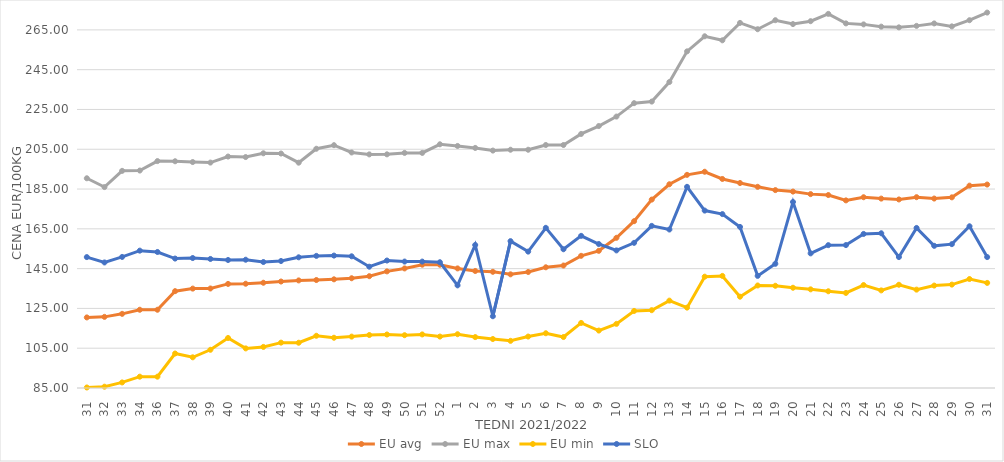
| Category | EU avg | EU max | EU min | SLO |
|---|---|---|---|---|
| 31.0 | 120.473 | 190.42 | 85.26 | 150.8 |
| 32.0 | 120.756 | 186 | 85.65 | 148.1 |
| 33.0 | 122.274 | 194.145 | 87.8 | 150.88 |
| 34.0 | 124.332 | 194.304 | 90.69 | 154.04 |
| 36.0 | 124.332 | 199.06 | 90.69 | 153.37 |
| 37.0 | 133.685 | 198.97 | 102.334 | 150.06 |
| 38.0 | 134.959 | 198.57 | 100.43 | 150.32 |
| 39.0 | 135.021 | 198.3 | 104.21 | 149.86 |
| 40.0 | 137.315 | 201.34 | 110.15 | 149.34 |
| 41.0 | 137.411 | 201.081 | 104.9 | 149.48 |
| 42.0 | 137.908 | 202.98 | 105.65 | 148.32 |
| 43.0 | 138.52 | 202.856 | 107.8 | 148.83 |
| 44.0 | 139.076 | 198.26 | 107.75 | 150.69 |
| 45.0 | 139.275 | 205.257 | 111.25 | 151.41 |
| 46.0 | 139.626 | 207.046 | 110.26 | 151.56 |
| 47.0 | 140.17 | 203.387 | 110.83 | 151.2 |
| 48.0 | 141.2 | 202.42 | 111.62 | 145.97 |
| 49.0 | 143.614 | 202.45 | 111.89 | 149.07 |
| 50.0 | 145.101 | 203.17 | 111.54 | 148.55 |
| 51.0 | 146.984 | 203.17 | 111.93 | 148.54 |
| 52.0 | 146.958 | 207.5 | 110.85 | 148.22 |
| 1.0 | 145.11 | 206.66 | 112.04 | 136.59 |
| 2.0 | 143.822 | 205.67 | 110.59 | 156.88 |
| 3.0 | 143.402 | 204.34 | 109.62 | 121.07 |
| 4.0 | 142.134 | 204.76 | 108.71 | 158.82 |
| 5.0 | 143.314 | 204.76 | 110.86 | 153.55 |
| 6.0 | 145.677 | 207.14 | 112.52 | 165.51 |
| 7.0 | 146.556 | 207.14 | 110.619 | 154.74 |
| 8.0 | 151.439 | 212.7 | 117.709 | 161.48 |
| 9.0 | 153.947 | 216.67 | 113.871 | 157.38 |
| 10.0 | 160.496 | 221.43 | 117.233 | 154.16 |
| 11.0 | 168.845 | 228.17 | 123.737 | 157.96 |
| 12.0 | 179.714 | 228.97 | 124.105 | 166.49 |
| 13.0 | 187.409 | 238.81 | 128.918 | 164.66 |
| 14.0 | 192.137 | 254.21 | 125.399 | 186.11 |
| 15.0 | 193.697 | 261.79 | 140.954 | 174.18 |
| 16.0 | 190.066 | 259.76 | 141.337 | 172.42 |
| 17.0 | 188.031 | 268.52 | 130.897 | 165.96 |
| 18.0 | 186.119 | 265.34 | 136.529 | 141.36 |
| 19.0 | 184.47 | 269.87 | 136.387 | 147.43 |
| 20.0 | 183.734 | 267.92 | 135.392 | 178.51 |
| 21.0 | 182.45 | 269.38 | 134.589 | 152.67 |
| 22.0 | 181.991 | 273.06 | 133.621 | 156.8 |
| 23.0 | 179.308 | 268.27 | 132.787 | 156.84 |
| 24.0 | 180.886 | 267.77 | 136.75 | 162.44 |
| 25.0 | 180.2 | 266.63 | 134.058 | 162.78 |
| 26.0 | 179.77 | 266.27 | 136.895 | 150.82 |
| 27.0 | 180.913 | 267.02 | 134.44 | 165.45 |
| 28.0 | 180.226 | 268.25 | 136.486 | 156.46 |
| 29.0 | 180.834 | 266.77 | 136.97 | 157.31 |
| 30.0 | 186.714 | 269.87 | 139.777 | 166.29 |
| 31.0 | 187.266 | 273.7 | 137.828 | 150.81 |